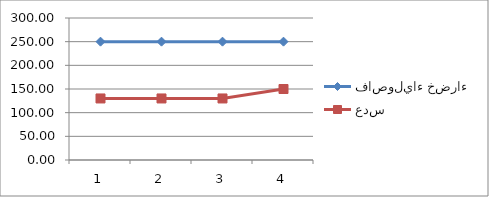
| Category | فاصولياء خضراء | عدس |
|---|---|---|
| 0 | 250 | 130 |
| 1 | 250 | 130 |
| 2 | 250 | 130 |
| 3 | 250 | 150 |